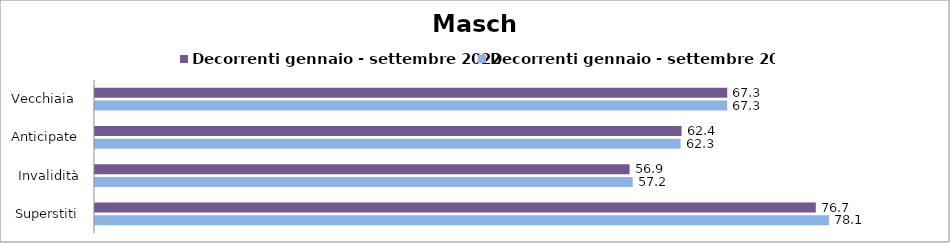
| Category | Decorrenti gennaio - settembre 2022 | Decorrenti gennaio - settembre 2023 |
|---|---|---|
| Vecchiaia  | 67.26 | 67.25 |
| Anticipate | 62.4 | 62.3 |
| Invalidità | 56.87 | 57.2 |
| Superstiti | 76.68 | 78.09 |